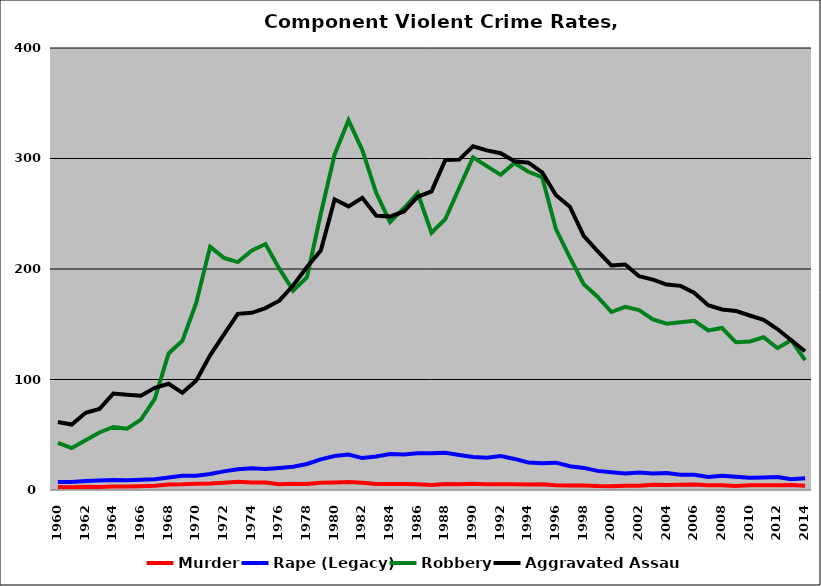
| Category | Murder | Rape (Legacy) | Robbery | Aggravated Assault |
|---|---|---|---|---|
| 1960.0 | 2.703 | 7.286 | 42.708 | 61.565 |
| 1961.0 | 2.45 | 7.335 | 37.972 | 59.257 |
| 1962.0 | 2.994 | 8.167 | 45.092 | 69.832 |
| 1963.0 | 2.798 | 8.671 | 52.04 | 73.261 |
| 1964.0 | 3.098 | 9.114 | 57.049 | 87.219 |
| 1965.0 | 3.233 | 8.931 | 55.403 | 86.286 |
| 1966.0 | 3.479 | 9.278 | 63.743 | 85.402 |
| 1967.0 | 3.941 | 9.667 | 82.493 | 92.446 |
| 1968.0 | 5.058 | 11.317 | 123.58 | 96.143 |
| 1969.0 | 5.162 | 12.787 | 135.101 | 87.941 |
| 1970.0 | 5.748 | 12.932 | 169.43 | 99.035 |
| 1971.0 | 5.836 | 14.493 | 220.027 | 121.849 |
| 1972.0 | 6.529 | 16.873 | 210.099 | 140.831 |
| 1973.0 | 7.417 | 18.788 | 206.208 | 159.448 |
| 1974.0 | 6.78 | 19.659 | 216.63 | 160.314 |
| 1975.0 | 6.834 | 18.931 | 222.622 | 164.612 |
| 1976.0 | 5.18 | 19.915 | 200.314 | 171.36 |
| 1977.0 | 5.567 | 20.971 | 180.42 | 185.073 |
| 1978.0 | 5.432 | 23.57 | 192.603 | 201.856 |
| 1979.0 | 6.601 | 27.782 | 250.027 | 216.776 |
| 1980.0 | 6.864 | 30.74 | 303.712 | 263.042 |
| 1981.0 | 7.323 | 32.077 | 334.563 | 256.682 |
| 1982.0 | 6.48 | 28.892 | 307.61 | 264.372 |
| 1983.0 | 5.343 | 30.343 | 268.961 | 248.433 |
| 1984.0 | 5.349 | 32.548 | 242.422 | 247.412 |
| 1985.0 | 5.382 | 32.055 | 254.985 | 252.036 |
| 1986.0 | 5.236 | 33.215 | 268.675 | 265.354 |
| 1987.0 | 4.575 | 33.355 | 232.821 | 270.269 |
| 1988.0 | 5.324 | 33.679 | 245.168 | 298.64 |
| 1989.0 | 5.093 | 31.657 | 273.255 | 298.979 |
| 1990.0 | 5.588 | 29.844 | 301.015 | 311.105 |
| 1991.0 | 5.232 | 29.111 | 293.093 | 307.32 |
| 1992.0 | 5.097 | 30.71 | 285.223 | 304.789 |
| 1993.0 | 5.305 | 28.113 | 295.964 | 297.474 |
| 1994.0 | 5.01 | 24.949 | 287.981 | 296.23 |
| 1995.0 | 5.148 | 24.254 | 283.021 | 287.351 |
| 1996.0 | 4.231 | 24.737 | 235.829 | 266.738 |
| 1997.0 | 4.185 | 21.47 | 210.567 | 256.426 |
| 1998.0 | 4.005 | 20 | 186.186 | 229.982 |
| 1999.0 | 3.524 | 17.302 | 174.902 | 216.138 |
| 2000.0 | 3.435 | 16.127 | 161.07 | 203.212 |
| 2001.0 | 3.948 | 15.016 | 165.783 | 204.086 |
| 2002.0 | 3.953 | 15.918 | 162.736 | 193.499 |
| 2003.0 | 4.698 | 14.903 | 154.378 | 190.364 |
| 2004.0 | 4.513 | 15.325 | 150.556 | 185.88 |
| 2005.0 | 4.791 | 13.88 | 151.842 | 184.749 |
| 2006.0 | 4.894 | 13.766 | 153.108 | 178.336 |
| 2007.0 | 4.386 | 11.881 | 144.475 | 167.202 |
| 2008.0 | 4.34 | 12.951 | 146.605 | 163.354 |
| 2009.0 | 3.663 | 11.955 | 133.663 | 162.086 |
| 2010.0 | 4.22 | 11.158 | 134.419 | 157.93 |
| 2011.0 | 4.301 | 11.387 | 138.193 | 154.028 |
| 2012.0 | 4.375 | 11.672 | 128.387 | 145.685 |
| 2013.0 | 4.533 | 9.662 | 135.6 | 135.454 |
| 2014.0 | 3.905 | 10.662 | 117.451 | 125.585 |